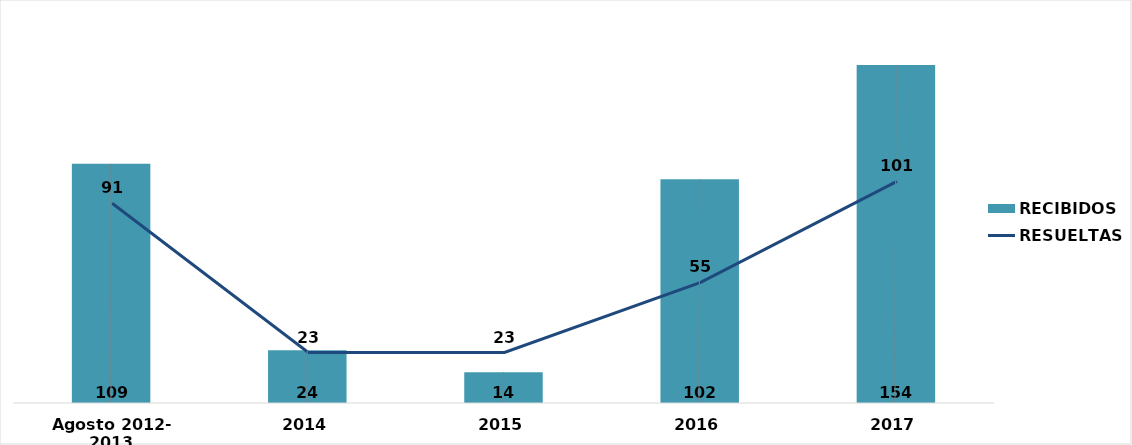
| Category | RECIBIDOS |
|---|---|
| Agosto 2012- 2013 | 109 |
| 2014 | 24 |
| 2015 | 14 |
| 2016 | 102 |
| 2017 | 154 |